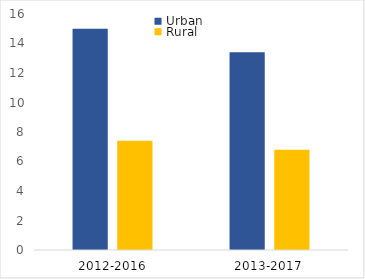
| Category | Urban | Rural |
|---|---|---|
| 2012-2016 | 15 | 7.4 |
| 2013-2017 | 13.4 | 6.8 |